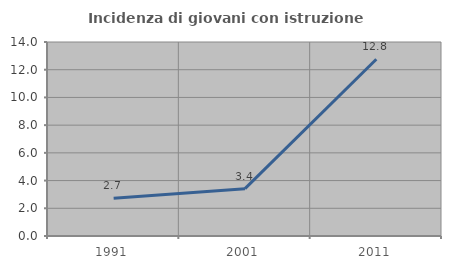
| Category | Incidenza di giovani con istruzione universitaria |
|---|---|
| 1991.0 | 2.727 |
| 2001.0 | 3.415 |
| 2011.0 | 12.755 |